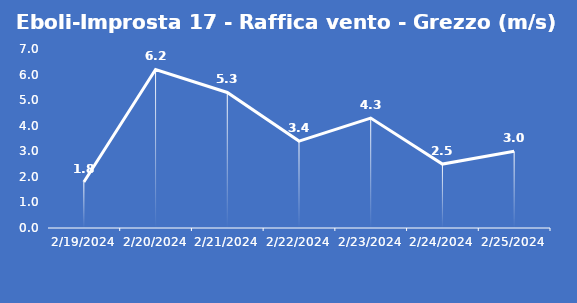
| Category | Eboli-Improsta 17 - Raffica vento - Grezzo (m/s) |
|---|---|
| 2/19/24 | 1.8 |
| 2/20/24 | 6.2 |
| 2/21/24 | 5.3 |
| 2/22/24 | 3.4 |
| 2/23/24 | 4.3 |
| 2/24/24 | 2.5 |
| 2/25/24 | 3 |